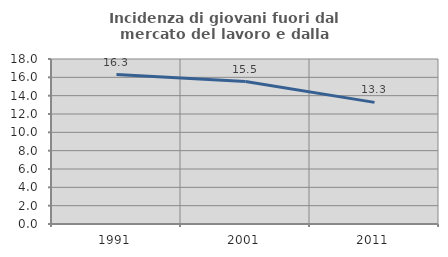
| Category | Incidenza di giovani fuori dal mercato del lavoro e dalla formazione  |
|---|---|
| 1991.0 | 16.301 |
| 2001.0 | 15.545 |
| 2011.0 | 13.267 |